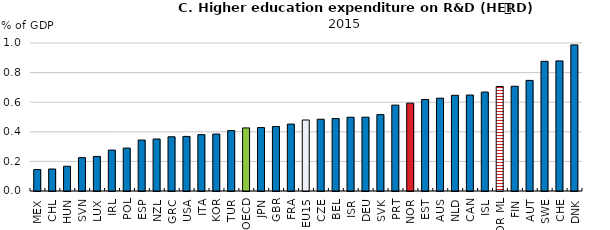
| Category | Series 0 |
|---|---|
| MEX | 0.145 |
| CHL | 0.149 |
| HUN | 0.167 |
| SVN | 0.225 |
| LUX | 0.234 |
| IRL | 0.277 |
| POL | 0.29 |
| ESP | 0.344 |
| NZL | 0.351 |
| GRC | 0.366 |
| USA | 0.369 |
| ITA | 0.381 |
| KOR | 0.385 |
| TUR | 0.408 |
| OECD | 0.426 |
| JPN | 0.429 |
| GBR | 0.436 |
| FRA | 0.452 |
| EU15 | 0.48 |
| CZE | 0.485 |
| BEL | 0.49 |
| ISR | 0.498 |
| DEU | 0.499 |
| SVK | 0.516 |
| PRT | 0.58 |
| NOR | 0.593 |
| EST | 0.618 |
| AUS | 0.627 |
| NLD | 0.647 |
| CAN | 0.648 |
| ISL | 0.669 |
| NOR ML | 0.706 |
| FIN | 0.708 |
| AUT | 0.747 |
| SWE | 0.876 |
| CHE | 0.879 |
| DNK | 0.987 |